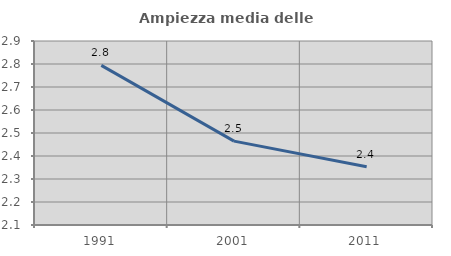
| Category | Ampiezza media delle famiglie |
|---|---|
| 1991.0 | 2.794 |
| 2001.0 | 2.465 |
| 2011.0 | 2.353 |